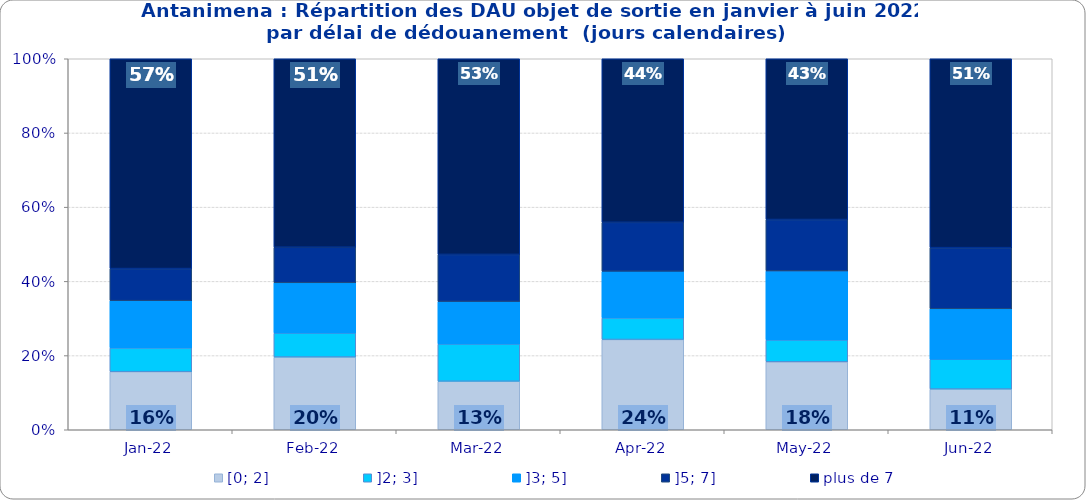
| Category | [0; 2] | ]2; 3] | ]3; 5] | ]5; 7] | plus de 7 |
|---|---|---|---|---|---|
| 2022-01-01 | 0.157 | 0.064 | 0.127 | 0.087 | 0.566 |
| 2022-02-01 | 0.196 | 0.065 | 0.136 | 0.096 | 0.508 |
| 2022-03-01 | 0.131 | 0.1 | 0.115 | 0.127 | 0.527 |
| 2022-04-01 | 0.243 | 0.058 | 0.126 | 0.132 | 0.441 |
| 2022-05-01 | 0.183 | 0.059 | 0.186 | 0.139 | 0.433 |
| 2022-06-01 | 0.11 | 0.08 | 0.136 | 0.165 | 0.509 |